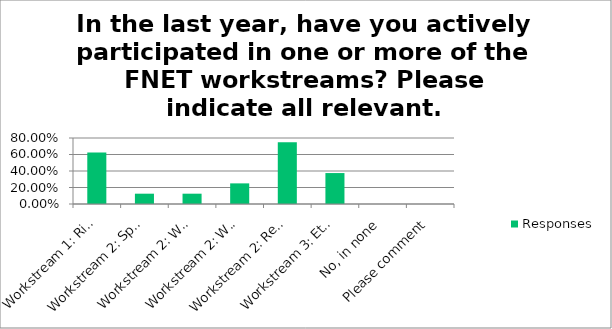
| Category | Responses |
|---|---|
| Workstream 1: Risk Assessment & Mitigation | 0.625 |
| Workstream 2: Spices | 0.125 |
| Workstream 2: Warehousing and Logistics | 0.125 |
| Workstream 2: Worker Representation | 0.25 |
| Workstream 2: Recruitment Fees | 0.75 |
| Workstream 3: Ethical Engagement | 0.375 |
| No, in none | 0 |
| Please comment | 0 |